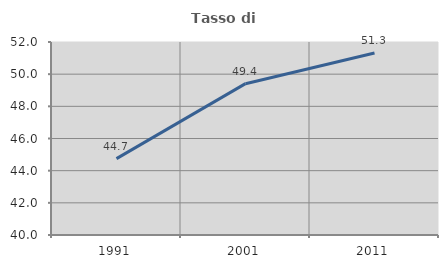
| Category | Tasso di occupazione   |
|---|---|
| 1991.0 | 44.748 |
| 2001.0 | 49.409 |
| 2011.0 | 51.318 |